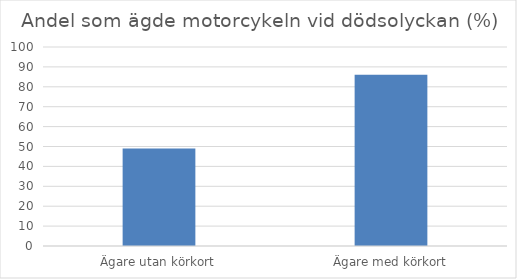
| Category | Andel % |
|---|---|
| Ägare utan körkort | 49 |
| Ägare med körkort | 86 |